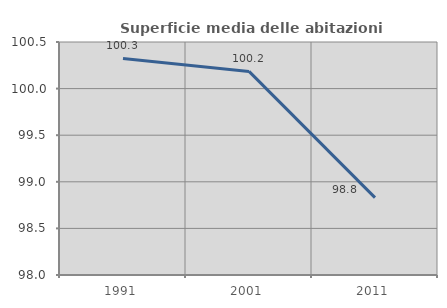
| Category | Superficie media delle abitazioni occupate |
|---|---|
| 1991.0 | 100.323 |
| 2001.0 | 100.184 |
| 2011.0 | 98.831 |